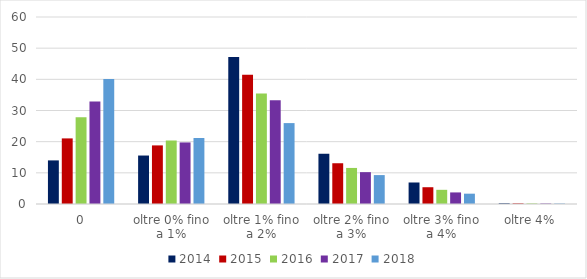
| Category | 2014 | 2015 | 2016 | 2017 | 2018 |
|---|---|---|---|---|---|
| 0 | 13.99 | 21.048 | 27.838 | 32.859 | 40.127 |
| oltre 0% fino a 1% | 15.552 | 18.802 | 20.373 | 19.753 | 21.168 |
| oltre 1% fino a 2% | 47.196 | 41.489 | 35.483 | 33.287 | 25.958 |
| oltre 2% fino a 3% | 16.123 | 13.076 | 11.571 | 10.22 | 9.277 |
| oltre 3% fino a 4% | 6.901 | 5.382 | 4.549 | 3.714 | 3.312 |
| oltre 4% | 0.238 | 0.203 | 0.185 | 0.166 | 0.158 |